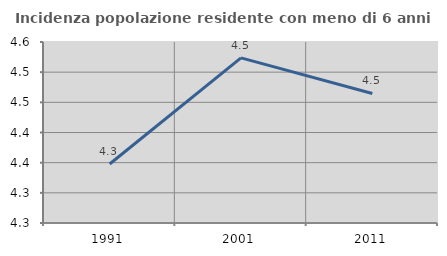
| Category | Incidenza popolazione residente con meno di 6 anni |
|---|---|
| 1991.0 | 4.348 |
| 2001.0 | 4.524 |
| 2011.0 | 4.465 |